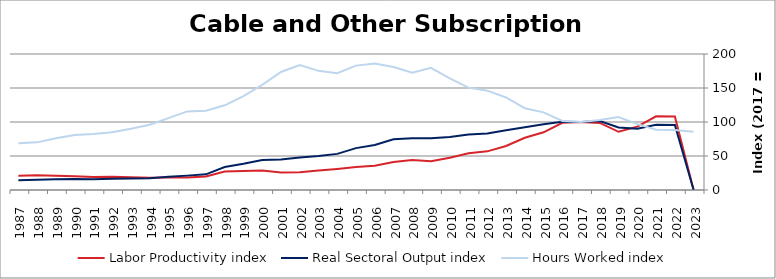
| Category | Labor Productivity index | Real Sectoral Output index | Hours Worked index |
|---|---|---|---|
| 2023.0 | 0 | 0 | 85.537 |
| 2022.0 | 108.157 | 95.482 | 88.281 |
| 2021.0 | 108.426 | 96.03 | 88.567 |
| 2020.0 | 93.152 | 90.258 | 96.893 |
| 2019.0 | 85.617 | 91.978 | 107.43 |
| 2018.0 | 98.632 | 101.465 | 102.872 |
| 2017.0 | 100 | 100 | 100 |
| 2016.0 | 98.879 | 100.472 | 101.611 |
| 2015.0 | 84.801 | 96.854 | 114.214 |
| 2014.0 | 76.817 | 92.373 | 120.251 |
| 2013.0 | 64.657 | 88.002 | 136.107 |
| 2012.0 | 56.824 | 83.023 | 146.105 |
| 2011.0 | 54.146 | 81.505 | 150.529 |
| 2010.0 | 47.456 | 77.893 | 164.137 |
| 2009.0 | 42.413 | 76.219 | 179.706 |
| 2008.0 | 44.083 | 75.963 | 172.318 |
| 2007.0 | 41.275 | 74.615 | 180.777 |
| 2006.0 | 35.575 | 66.132 | 185.895 |
| 2005.0 | 33.667 | 61.588 | 182.934 |
| 2004.0 | 30.936 | 53.111 | 171.681 |
| 2003.0 | 28.519 | 49.97 | 175.218 |
| 2002.0 | 26.024 | 47.779 | 183.593 |
| 2001.0 | 25.788 | 44.768 | 173.596 |
| 2000.0 | 28.562 | 44.151 | 154.581 |
| 1999.0 | 27.939 | 38.583 | 138.094 |
| 1998.0 | 27.087 | 33.73 | 124.525 |
| 1997.0 | 19.738 | 22.995 | 116.501 |
| 1996.0 | 18.29 | 21.138 | 115.573 |
| 1995.0 | 18.277 | 19.33 | 105.762 |
| 1994.0 | 18.141 | 17.397 | 95.901 |
| 1993.0 | 18.616 | 16.741 | 89.93 |
| 1992.0 | 19.331 | 16.39 | 84.785 |
| 1991.0 | 19.111 | 15.731 | 82.315 |
| 1990.0 | 20.045 | 16.18 | 80.72 |
| 1989.0 | 20.935 | 15.916 | 76.024 |
| 1988.0 | 21.596 | 15.129 | 70.053 |
| 1987.0 | 20.972 | 14.451 | 68.906 |